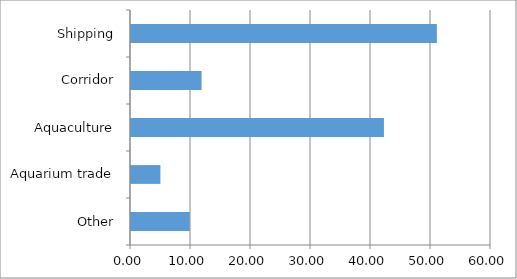
| Category | Series 0 |
|---|---|
| Other | 9.804 |
| Aquarium trade | 4.902 |
| Aquaculture | 42.157 |
| Corridor | 11.765 |
| Shipping | 50.98 |